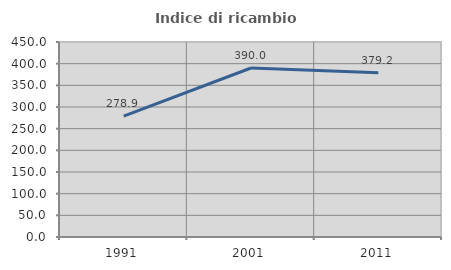
| Category | Indice di ricambio occupazionale  |
|---|---|
| 1991.0 | 278.947 |
| 2001.0 | 390 |
| 2011.0 | 379.167 |